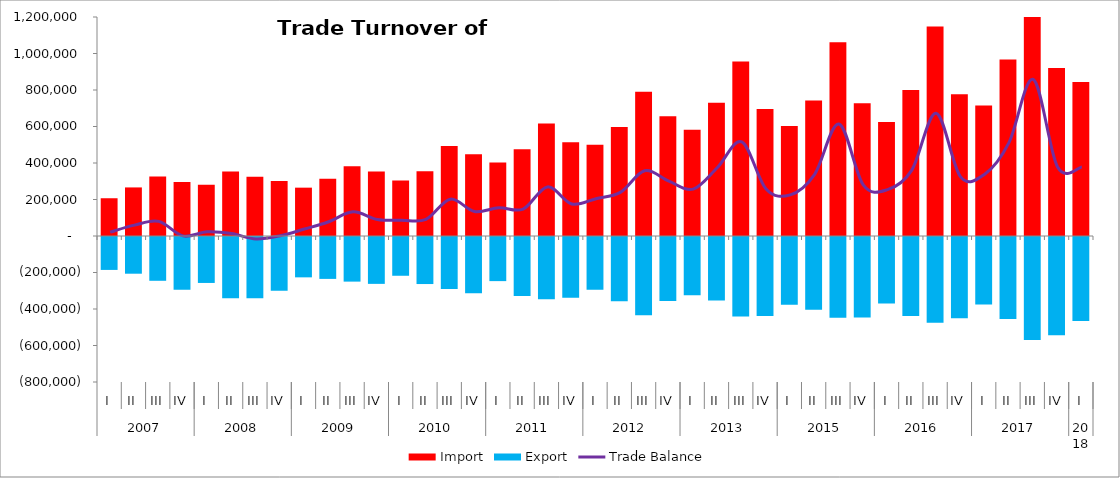
| Category | Import | Export |
|---|---|---|
| 0 | 206876.453 | -185862.119 |
| 1 | 266162.034 | -206602.171 |
| 2 | 325432.039 | -245424.789 |
| 3 | 295638.902 | -295030.919 |
| 4 | 280196.682 | -257248.178 |
| 5 | 354066.036 | -340846.499 |
| 6 | 324889.482 | -341447.222 |
| 7 | 301301.793 | -299882.459 |
| 8 | 264903.998 | -226561.536 |
| 9 | 313311.481 | -235037.426 |
| 10 | 382383.207 | -249991.263 |
| 11 | 353010.364 | -262293.067 |
| 12 | 304483.789 | -217879.02 |
| 13 | 354263.8 | -263232.936 |
| 14 | 492599.694 | -290888.678 |
| 15 | 447423.972 | -313316.693 |
| 16 | 402433.78 | -247232.2 |
| 17 | 475906.544 | -328431.291 |
| 18 | 616171.319 | -347095.2 |
| 19 | 513645.707 | -337933.603 |
| 20 | 499607.449 | -295085.361 |
| 21 | 596895.347 | -358072.392 |
| 22 | 791093.658 | -433796.826 |
| 23 | 656411.742 | -355854.896 |
| 24 | 582176.614 | -325310.604 |
| 25 | 729496.889 | -354020.424 |
| 26 | 956513.447 | -441031.269 |
| 27 | 695845.992 | -438198.975 |
| 28 | 602133.659 | -376572.246 |
| 29 | 742725.876 | -404597.572 |
| 30 | 1061185.775 | -447435.407 |
| 31 | 727096.737 | -446754.878 |
| 32 | 624569.616 | -370507.095 |
| 33 | 799859.375 | -438638.214 |
| 34 | 1147701.128 | -474916.674 |
| 35 | 776931.366 | -451354.128 |
| 36 | 714491.312 | -375970.87 |
| 37 | 967042.006 | -455164.095 |
| 38 | 1427808.272 | -569946.006 |
| 39 | 920988.9 | -543215 |
| 40 | 844143.887 | -465841.79 |